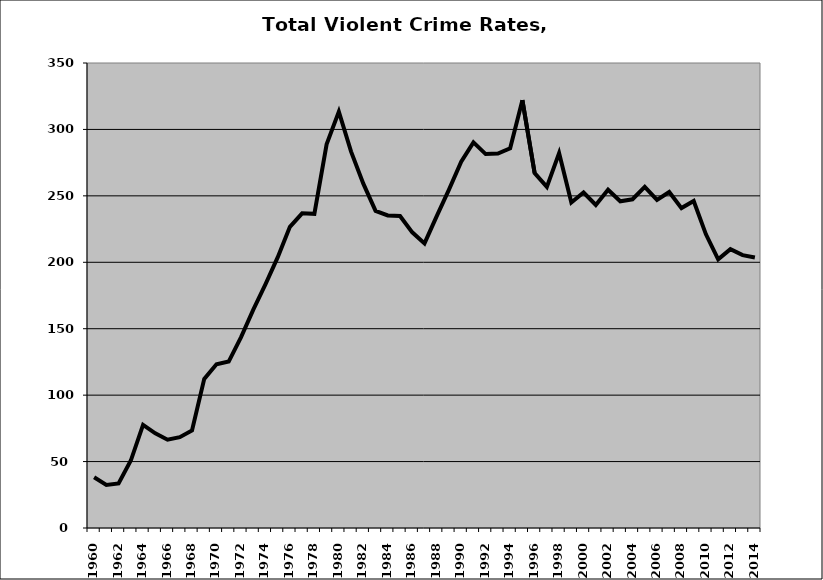
| Category | VCR |
|---|---|
| 1960.0 | 38.22 |
| 1961.0 | 32.456 |
| 1962.0 | 33.524 |
| 1963.0 | 50.771 |
| 1964.0 | 77.601 |
| 1965.0 | 71.243 |
| 1966.0 | 66.427 |
| 1967.0 | 68.383 |
| 1968.0 | 73.475 |
| 1969.0 | 112.256 |
| 1970.0 | 123.281 |
| 1971.0 | 125.273 |
| 1972.0 | 143.519 |
| 1973.0 | 164.156 |
| 1974.0 | 183.354 |
| 1975.0 | 203.659 |
| 1976.0 | 226.715 |
| 1977.0 | 236.873 |
| 1978.0 | 236.446 |
| 1979.0 | 288.729 |
| 1980.0 | 313.365 |
| 1981.0 | 283.316 |
| 1982.0 | 259.171 |
| 1983.0 | 238.726 |
| 1984.0 | 235.265 |
| 1985.0 | 234.826 |
| 1986.0 | 222.532 |
| 1987.0 | 214.228 |
| 1988.0 | 234.735 |
| 1989.0 | 254.635 |
| 1990.0 | 275.739 |
| 1991.0 | 290.279 |
| 1992.0 | 281.443 |
| 1993.0 | 281.802 |
| 1994.0 | 285.79 |
| 1995.0 | 322.012 |
| 1996.0 | 267.199 |
| 1997.0 | 256.777 |
| 1998.0 | 282.181 |
| 1999.0 | 244.947 |
| 2000.0 | 252.482 |
| 2001.0 | 243.15 |
| 2002.0 | 254.556 |
| 2003.0 | 245.934 |
| 2004.0 | 247.43 |
| 2005.0 | 256.757 |
| 2006.0 | 246.92 |
| 2007.0 | 252.901 |
| 2008.0 | 240.785 |
| 2009.0 | 246.151 |
| 2010.0 | 221.041 |
| 2011.0 | 202.179 |
| 2012.0 | 209.828 |
| 2013.0 | 205.414 |
| 2014.0 | 203.553 |